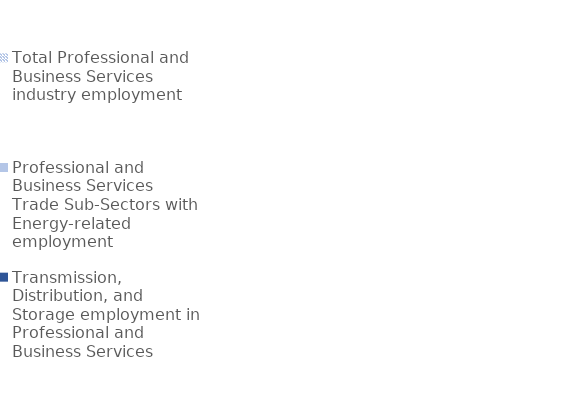
| Category | Total Professional and Business Services industry employment | Professional and Business Services Trade Sub-Sectors with Energy-related employment | Transmission, Distribution, and Storage employment in Professional and Business Services |
|---|---|---|---|
| Professional & Business Services | 27769094 | 8450441 | 133047 |